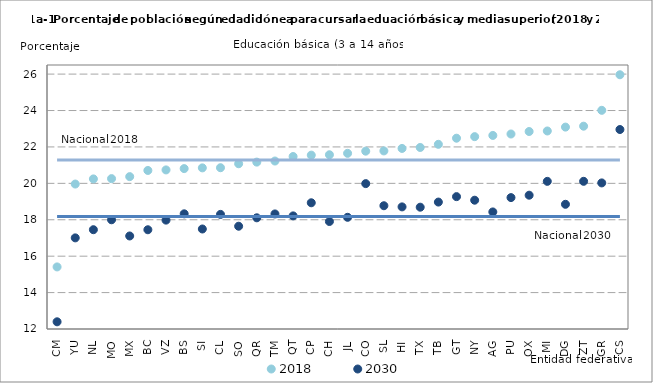
| Category | 2018 | 2030 | N_18 | N_30 |
|---|---|---|---|---|
| CM | 15.41 | 12.395 | 21.283 | 18.175 |
| YU | 19.961 | 17.006 | 21.283 | 18.175 |
| NL | 20.244 | 17.454 | 21.283 | 18.175 |
| MO | 20.259 | 17.999 | 21.283 | 18.175 |
| MX | 20.369 | 17.109 | 21.283 | 18.175 |
| BC | 20.708 | 17.451 | 21.283 | 18.175 |
| VZ | 20.737 | 17.98 | 21.283 | 18.175 |
| BS | 20.81 | 18.326 | 21.283 | 18.175 |
| SI | 20.85 | 17.493 | 21.283 | 18.175 |
| CL | 20.858 | 18.294 | 21.283 | 18.175 |
| SO | 21.077 | 17.644 | 21.283 | 18.175 |
| QR | 21.166 | 18.107 | 21.283 | 18.175 |
| TM | 21.226 | 18.319 | 21.283 | 18.175 |
| QT | 21.474 | 18.213 | 21.283 | 18.175 |
| CP | 21.549 | 18.933 | 21.283 | 18.175 |
| CH | 21.571 | 17.904 | 21.283 | 18.175 |
| JL | 21.648 | 18.135 | 21.283 | 18.175 |
| CO | 21.768 | 19.984 | 21.283 | 18.175 |
| SL | 21.781 | 18.77 | 21.283 | 18.175 |
| HI | 21.918 | 18.707 | 21.283 | 18.175 |
| TX | 21.971 | 18.69 | 21.283 | 18.175 |
| TB | 22.143 | 18.971 | 21.283 | 18.175 |
| GT | 22.479 | 19.27 | 21.283 | 18.175 |
| NY | 22.565 | 19.073 | 21.283 | 18.175 |
| AG | 22.632 | 18.429 | 21.283 | 18.175 |
| PU | 22.71 | 19.217 | 21.283 | 18.175 |
| OX | 22.847 | 19.349 | 21.283 | 18.175 |
| MI | 22.877 | 20.109 | 21.283 | 18.175 |
| DG | 23.089 | 18.848 | 21.283 | 18.175 |
| ZT | 23.139 | 20.111 | 21.283 | 18.175 |
| GR | 24.011 | 20.024 | 21.283 | 18.175 |
| CS | 25.964 | 22.956 | 21.283 | 18.175 |